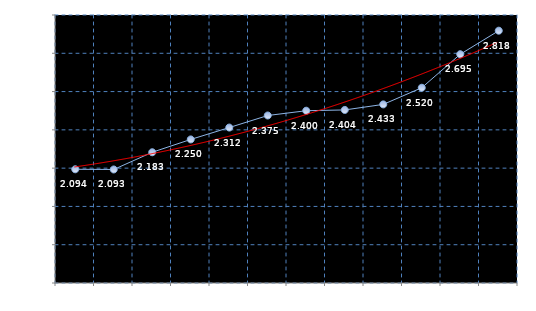
| Category | Series 0 |
|---|---|
| Feb 16 | 2.094 |
| Mar 16 | 2.093 |
| Apr 16 | 2.183 |
| May 16 | 2.25 |
| Jun 16 | 2.312 |
| Jul 16 | 2.375 |
| Aug 16 | 2.4 |
| Sep 16 | 2.404 |
| Oct 16 | 2.433 |
| Nov 16 | 2.52 |
| Dec 16 | 2.695 |
| Jan 17 | 2.818 |